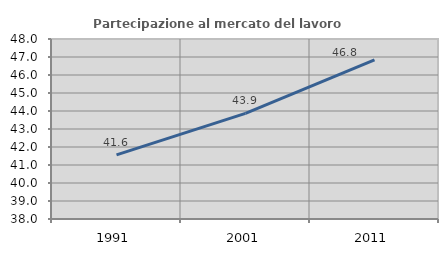
| Category | Partecipazione al mercato del lavoro  femminile |
|---|---|
| 1991.0 | 41.564 |
| 2001.0 | 43.864 |
| 2011.0 | 46.845 |